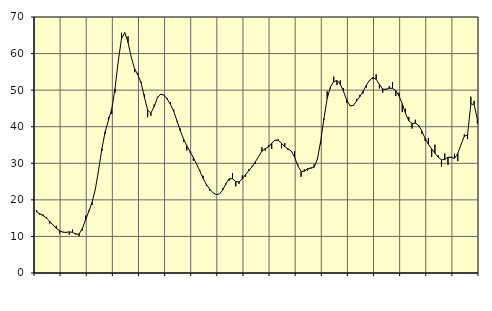
| Category | Piggar | Series 1 |
|---|---|---|
| nan | 17.2 | 16.74 |
| 87.0 | 15.9 | 16.19 |
| 87.0 | 16 | 15.67 |
| 87.0 | 15.2 | 15.03 |
| nan | 13.5 | 14.12 |
| 88.0 | 13.1 | 13.16 |
| 88.0 | 12.9 | 12.21 |
| 88.0 | 10.8 | 11.57 |
| nan | 11.3 | 11.16 |
| 89.0 | 11.2 | 11.11 |
| 89.0 | 10.5 | 11.26 |
| 89.0 | 11.9 | 11.1 |
| nan | 10.8 | 10.61 |
| 90.0 | 10.1 | 10.65 |
| 90.0 | 11.6 | 12.15 |
| 90.0 | 15.7 | 14.55 |
| nan | 17.1 | 16.88 |
| 91.0 | 18.6 | 19.32 |
| 91.0 | 22.9 | 23 |
| 91.0 | 28.3 | 28.25 |
| nan | 33.4 | 34.02 |
| 92.0 | 38.1 | 38.66 |
| 92.0 | 42.6 | 41.72 |
| 92.0 | 43.5 | 44.8 |
| nan | 49.3 | 50.37 |
| 93.0 | 58 | 57.94 |
| 93.0 | 65.7 | 64.07 |
| 93.0 | 65.6 | 65.72 |
| nan | 64.7 | 63.04 |
| 94.0 | 58.9 | 58.97 |
| 94.0 | 54.9 | 55.88 |
| 94.0 | 54.7 | 54.17 |
| nan | 52.3 | 52 |
| 95.0 | 48.9 | 48.16 |
| 95.0 | 42.6 | 44.56 |
| 95.0 | 43 | 43.71 |
| nan | 46.1 | 45.54 |
| 96.0 | 48.2 | 47.88 |
| 96.0 | 48.7 | 48.92 |
| 96.0 | 48.7 | 48.63 |
| nan | 47.8 | 47.56 |
| 97.0 | 46.7 | 46.06 |
| 97.0 | 44.7 | 44.18 |
| 97.0 | 41.4 | 41.62 |
| nan | 39.5 | 38.94 |
| 98.0 | 35.9 | 36.66 |
| 98.0 | 33.5 | 34.81 |
| 98.0 | 32.9 | 33.23 |
| nan | 30.7 | 31.56 |
| 99.0 | 29.8 | 29.81 |
| 99.0 | 28.1 | 27.87 |
| 99.0 | 26.6 | 25.85 |
| nan | 23.8 | 24.19 |
| 0.0 | 22.5 | 22.96 |
| 0.0 | 22 | 21.96 |
| 0.0 | 21.4 | 21.44 |
| nan | 21.6 | 21.63 |
| 1.0 | 23.2 | 22.71 |
| 1.0 | 24.2 | 24.47 |
| 1.0 | 25.3 | 25.78 |
| nan | 27.3 | 25.76 |
| 2.0 | 23.7 | 25.01 |
| 2.0 | 24.4 | 24.9 |
| 2.0 | 26.7 | 25.7 |
| nan | 26.3 | 26.93 |
| 3.0 | 28.4 | 28 |
| 3.0 | 29.3 | 29.04 |
| 3.0 | 29.8 | 30.39 |
| nan | 31.9 | 31.88 |
| 4.0 | 34.4 | 33.3 |
| 4.0 | 33.5 | 34.01 |
| 4.0 | 35 | 34.47 |
| nan | 33.9 | 35.48 |
| 5.0 | 36.1 | 36.34 |
| 5.0 | 36.6 | 36.27 |
| 5.0 | 34.1 | 35.5 |
| nan | 35.5 | 34.52 |
| 6.0 | 33.6 | 33.93 |
| 6.0 | 33.2 | 33.36 |
| 6.0 | 33.3 | 31.71 |
| nan | 29.7 | 29.33 |
| 7.0 | 26.3 | 27.75 |
| 7.0 | 28.4 | 27.83 |
| 7.0 | 28 | 28.53 |
| nan | 28.9 | 28.65 |
| 8.0 | 29.7 | 28.93 |
| 8.0 | 31.4 | 31.1 |
| 8.0 | 35.2 | 36.01 |
| nan | 41.8 | 42.21 |
| 9.0 | 49.7 | 47.71 |
| 9.0 | 50.4 | 50.9 |
| 9.0 | 53.7 | 52.36 |
| nan | 51.4 | 52.61 |
| 10.0 | 52.7 | 51.65 |
| 10.0 | 50.5 | 49.65 |
| 10.0 | 46.5 | 47.29 |
| nan | 45.6 | 45.73 |
| 11.0 | 45.7 | 45.82 |
| 11.0 | 47.6 | 47.01 |
| 11.0 | 48.7 | 48.24 |
| nan | 49.1 | 49.69 |
| 12.0 | 50.7 | 51.35 |
| 12.0 | 52.5 | 52.75 |
| 12.0 | 53 | 53.47 |
| nan | 54.3 | 52.96 |
| 13.0 | 50.5 | 51.56 |
| 13.0 | 49.3 | 50.29 |
| 13.0 | 50.4 | 50.19 |
| nan | 51.1 | 50.51 |
| 14.0 | 52.2 | 50.51 |
| 14.0 | 48.4 | 49.86 |
| 14.0 | 49.3 | 48.41 |
| nan | 44 | 46.28 |
| 15.0 | 44.9 | 43.66 |
| 15.0 | 42.7 | 41.61 |
| 15.0 | 39.5 | 40.86 |
| nan | 41.9 | 40.95 |
| 16.0 | 40.1 | 40.4 |
| 16.0 | 38.1 | 38.79 |
| 16.0 | 36.1 | 36.81 |
| nan | 36.9 | 35.18 |
| 17.0 | 31.7 | 33.96 |
| 17.0 | 35.1 | 32.74 |
| 17.0 | 32.2 | 31.65 |
| nan | 29.1 | 30.95 |
| 18.0 | 32.7 | 31.03 |
| 18.0 | 29.6 | 31.67 |
| 18.0 | 31.8 | 31.59 |
| nan | 32.6 | 31.38 |
| 19.0 | 30.6 | 32.67 |
| 19.0 | 35.1 | 35.09 |
| 19.0 | 37.9 | 37.4 |
| nan | 36.6 | 37.74 |
| 20.0 | 48.2 | 46.2 |
| 20.0 | 47.1 | 46.11 |
| 20.0 | 40.9 | 41.99 |